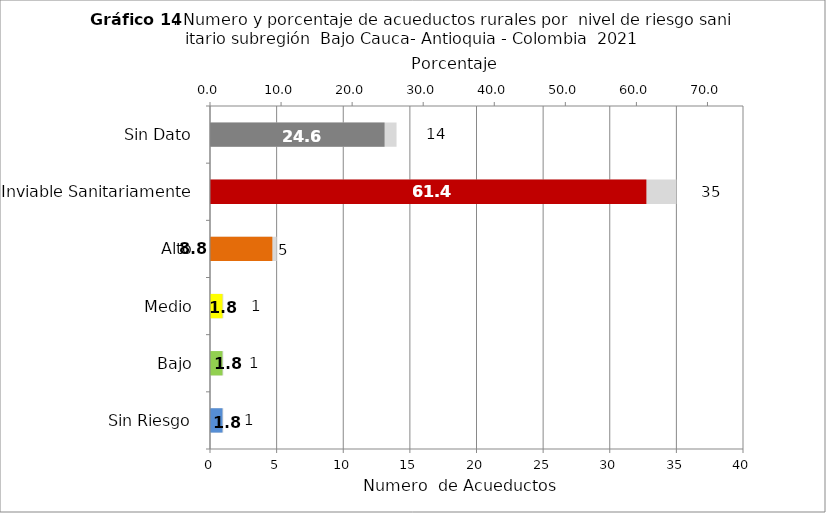
| Category | Número de Sistemas |
|---|---|
| Sin Riesgo | 1 |
| Bajo | 1 |
| Medio | 1 |
| Alto | 5 |
| Inviable Sanitariamente | 35 |
| Sin Dato | 14 |